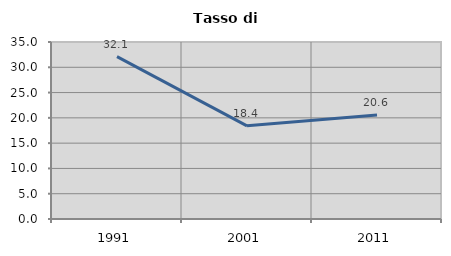
| Category | Tasso di disoccupazione   |
|---|---|
| 1991.0 | 32.108 |
| 2001.0 | 18.421 |
| 2011.0 | 20.588 |